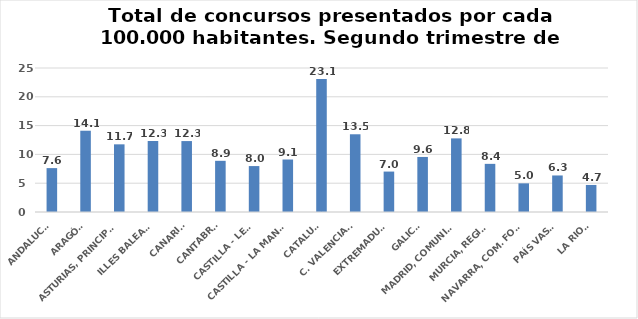
| Category | 22-T2 |
|---|---|
| ANDALUCÍA | 7.62 |
| ARAGÓN | 14.11 |
| ASTURIAS, PRINCIPADO | 11.747 |
| ILLES BALEARS | 12.327 |
| CANARIAS | 12.314 |
| CANTABRIA | 8.886 |
| CASTILLA - LEÓN | 7.974 |
| CASTILLA - LA MANCHA | 9.112 |
| CATALUÑA | 23.075 |
| C. VALENCIANA | 13.495 |
| EXTREMADURA | 7.019 |
| GALICIA | 9.557 |
| MADRID, COMUNIDAD | 12.781 |
| MURCIA, REGIÓN | 8.358 |
| NAVARRA, COM. FORAL | 4.973 |
| PAÍS VASCO | 6.343 |
| LA RIOJA | 4.695 |